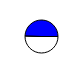
| Category | Series 0 |
|---|---|
| 0 | 29784 |
| 1 | 29268 |